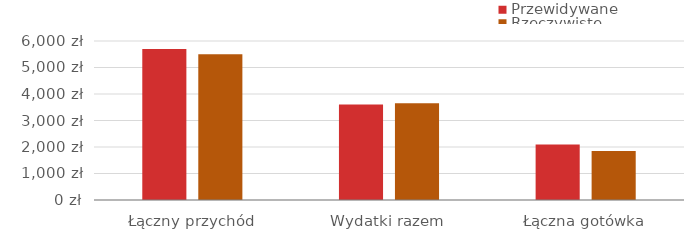
| Category | Przewidywane | Rzeczywiste |
|---|---|---|
| Łączny przychód | 5700 | 5500 |
| Wydatki razem | 3603 | 3655 |
| Łączna gotówka | 2097 | 1845 |